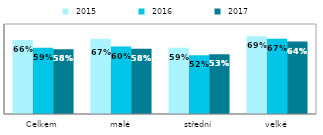
| Category |  2015 |  2016 |  2017 |
|---|---|---|---|
| Celkem | 0.657 | 0.59 | 0.575 |
| malé | 0.67 | 0.6 | 0.581 |
| střední | 0.59 | 0.522 | 0.532 |
| velké | 0.691 | 0.668 | 0.644 |